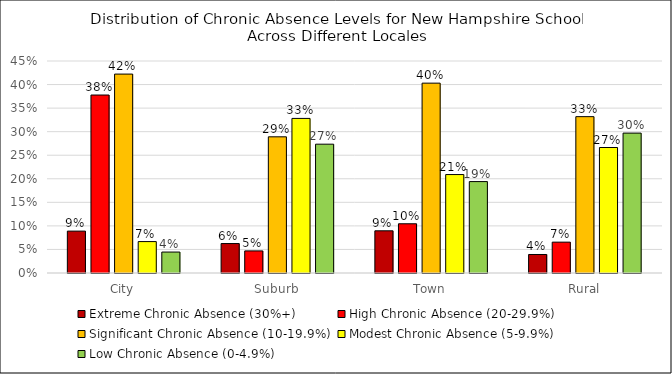
| Category | Extreme Chronic Absence (30%+) | High Chronic Absence (20-29.9%) | Significant Chronic Absence (10-19.9%) | Modest Chronic Absence (5-9.9%) | Low Chronic Absence (0-4.9%) |
|---|---|---|---|---|---|
| City | 0.089 | 0.378 | 0.422 | 0.067 | 0.044 |
| Suburb | 0.062 | 0.047 | 0.289 | 0.328 | 0.273 |
| Town | 0.09 | 0.104 | 0.403 | 0.209 | 0.194 |
| Rural | 0.039 | 0.066 | 0.332 | 0.266 | 0.297 |